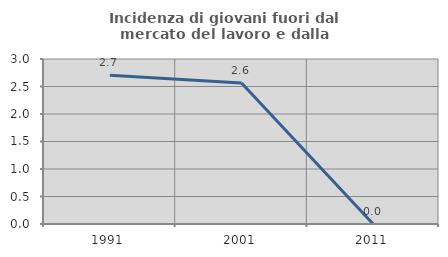
| Category | Incidenza di giovani fuori dal mercato del lavoro e dalla formazione  |
|---|---|
| 1991.0 | 2.703 |
| 2001.0 | 2.564 |
| 2011.0 | 0 |